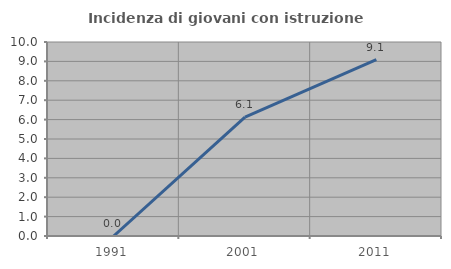
| Category | Incidenza di giovani con istruzione universitaria |
|---|---|
| 1991.0 | 0 |
| 2001.0 | 6.122 |
| 2011.0 | 9.091 |